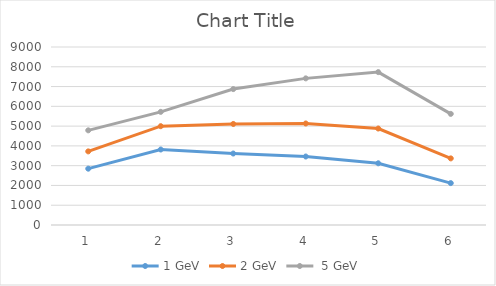
| Category | 1 GeV | 2 GeV |  5 GeV |
|---|---|---|---|
| 0 | 2848 | 3722 | 4786 |
| 1 | 3817 | 4996 | 5721 |
| 2 | 3614 | 5108 | 6872 |
| 3 | 3463 | 5133 | 7414 |
| 4 | 3121 | 4878 | 7730 |
| 5 | 2118 | 3368 | 5619 |